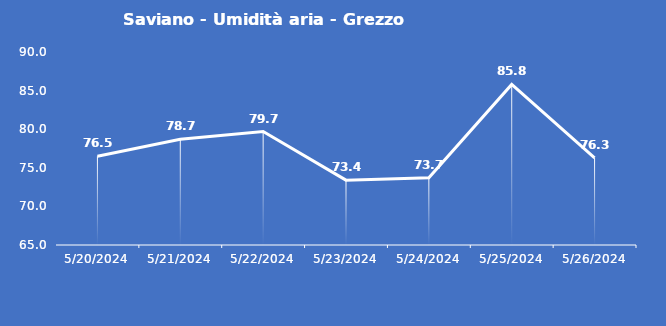
| Category | Saviano - Umidità aria - Grezzo (%) |
|---|---|
| 5/20/24 | 76.5 |
| 5/21/24 | 78.7 |
| 5/22/24 | 79.7 |
| 5/23/24 | 73.4 |
| 5/24/24 | 73.7 |
| 5/25/24 | 85.8 |
| 5/26/24 | 76.3 |